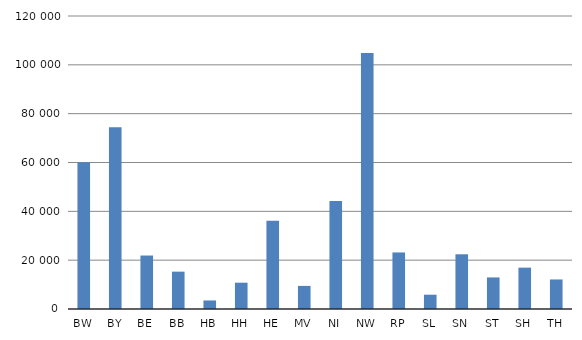
| Category | Gesundheitsausgaben in Mio. € | Summe von Feld1 |
|---|---|---|
| BW | 60099.492 | 0 |
| BY | 74484.052 | 0 |
| BE | 21896.612 | 0 |
| BB | 15296.866 | 0 |
| HB | 3497.287 | 0 |
| HH | 10774.338 | 0 |
| HE | 36171.298 | 0 |
| MV | 9456.32 | 0 |
| NI | 44248.66 | 0 |
| NW | 104827.388 | 0 |
| RP | 23161.259 | 0 |
| SL | 5858.393 | 0 |
| SN | 22405.056 | 0 |
| ST | 12926.473 | 0 |
| SH | 16934.318 | 0 |
| TH | 12096.184 | 0 |